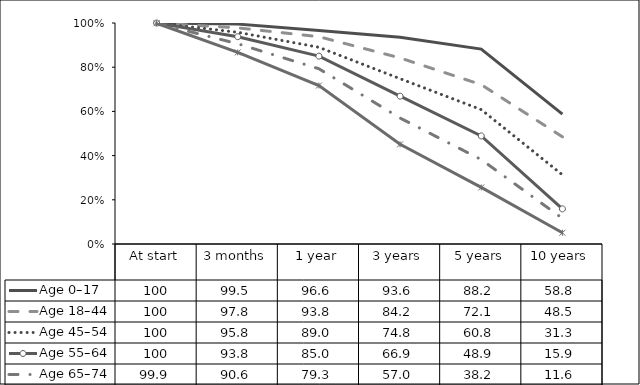
| Category | Age 0–17 | Age 18–44  | Age 45–54  | Age 55–64  | Age 65–74  | Age 75+  |
|---|---|---|---|---|---|---|
| At start | 100 | 100 | 100 | 100 | 99.9 | 99.9 |
| 3 months | 99.5 | 97.8 | 95.8 | 93.8 | 90.6 | 86.7 |
| 1 year | 96.6 | 93.8 | 89 | 85 | 79.3 | 71.7 |
| 3 years | 93.6 | 84.2 | 74.8 | 66.9 | 57 | 45.1 |
| 5 years | 88.2 | 72.1 | 60.8 | 48.9 | 38.2 | 25.6 |
| 10 years | 58.8 | 48.5 | 31.3 | 15.9 | 11.6 | 5.1 |